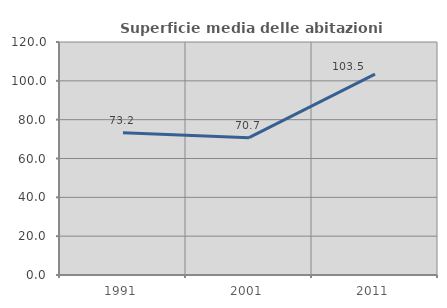
| Category | Superficie media delle abitazioni occupate |
|---|---|
| 1991.0 | 73.217 |
| 2001.0 | 70.719 |
| 2011.0 | 103.453 |